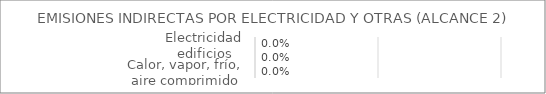
| Category | Series 0 |
|---|---|
| Electricidad edificios | 0 |
| Electricidad vehículos | 0 |
| Calor, vapor, frío, aire comprimido | 0 |